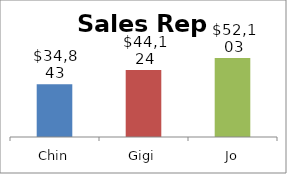
| Category | Total |
|---|---|
| Chin | 34843 |
| Gigi | 44124 |
| Jo | 52103 |